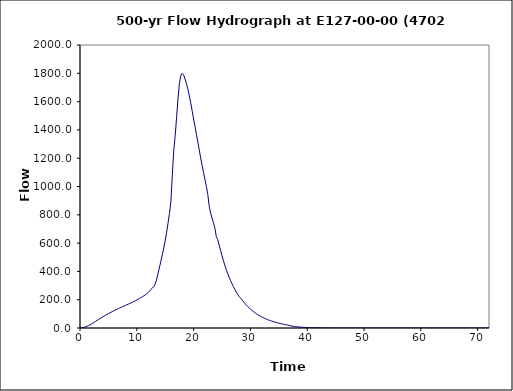
| Category | Series 0 |
|---|---|
| 0.0 | 0 |
| 0.25 | 0.6 |
| 0.5 | 2.4 |
| 0.75 | 5.6 |
| 1.0 | 9.3 |
| 1.25 | 13 |
| 1.5 | 17.1 |
| 1.75 | 22.1 |
| 2.0 | 27.8 |
| 2.25 | 34 |
| 2.5 | 40.4 |
| 2.75 | 46.8 |
| 3.0 | 53.3 |
| 3.25 | 59.8 |
| 3.5 | 66.1 |
| 3.75 | 72.3 |
| 4.0 | 78.4 |
| 4.25 | 84.4 |
| 4.5 | 90.2 |
| 4.75 | 95.9 |
| 5.0 | 101.5 |
| 5.25 | 106.9 |
| 5.5 | 112.2 |
| 5.75 | 117.4 |
| 6.0 | 122.5 |
| 6.25 | 127.5 |
| 6.5 | 132.3 |
| 6.75 | 137.1 |
| 7.0 | 141.8 |
| 7.25 | 146.4 |
| 7.5 | 150.9 |
| 7.75 | 155.4 |
| 8.0 | 159.8 |
| 8.25 | 164.1 |
| 8.5 | 168.5 |
| 8.75 | 172.9 |
| 9.0 | 177.5 |
| 9.25 | 182.3 |
| 9.5 | 187.3 |
| 9.75 | 192.6 |
| 10.0 | 198.1 |
| 10.25 | 203.8 |
| 10.5 | 209.4 |
| 10.75 | 215.2 |
| 11.0 | 221.2 |
| 11.25 | 227.6 |
| 11.5 | 234.6 |
| 11.75 | 242 |
| 12.0 | 250.1 |
| 12.25 | 261 |
| 12.5 | 272.3 |
| 12.75 | 282.1 |
| 13.0 | 293.8 |
| 13.25 | 312.9 |
| 13.5 | 345.9 |
| 13.75 | 387.7 |
| 14.0 | 430.7 |
| 14.25 | 474.2 |
| 14.5 | 519.7 |
| 14.75 | 565.1 |
| 15.0 | 616.7 |
| 15.25 | 675 |
| 15.5 | 742.5 |
| 15.75 | 809.1 |
| 16.0 | 892.6 |
| 16.25 | 1079.1 |
| 16.5 | 1253.3 |
| 16.75 | 1355 |
| 17.0 | 1486.6 |
| 17.25 | 1617.8 |
| 17.5 | 1728.8 |
| 17.75 | 1784.6 |
| 18.0 | 1799.1 |
| 18.25 | 1786.8 |
| 18.5 | 1759.4 |
| 18.75 | 1725.2 |
| 19.0 | 1685.9 |
| 19.25 | 1640.1 |
| 19.5 | 1588.2 |
| 19.75 | 1533.2 |
| 20.0 | 1476.7 |
| 20.25 | 1423.1 |
| 20.5 | 1369.1 |
| 20.75 | 1312.9 |
| 21.0 | 1256.4 |
| 21.25 | 1201.3 |
| 21.5 | 1148.8 |
| 21.75 | 1098 |
| 22.0 | 1048.8 |
| 22.25 | 999.6 |
| 22.5 | 943.3 |
| 22.75 | 859.5 |
| 23.0 | 812.7 |
| 23.25 | 776.2 |
| 23.5 | 742.7 |
| 23.75 | 704.3 |
| 24.0 | 645.8 |
| 24.25 | 622.8 |
| 24.5 | 585.9 |
| 24.75 | 546.6 |
| 25.0 | 510.1 |
| 25.25 | 475.8 |
| 25.5 | 442.5 |
| 25.75 | 412 |
| 26.0 | 385.1 |
| 26.25 | 359.4 |
| 26.5 | 335.7 |
| 26.75 | 313.5 |
| 27.0 | 292.8 |
| 27.25 | 273.5 |
| 27.5 | 255.4 |
| 27.75 | 238.4 |
| 28.0 | 222.7 |
| 28.25 | 212.3 |
| 28.5 | 200.1 |
| 28.75 | 186.9 |
| 29.0 | 174.7 |
| 29.25 | 163.4 |
| 29.5 | 152.7 |
| 29.75 | 142.8 |
| 30.0 | 133.6 |
| 30.25 | 124.9 |
| 30.5 | 116.8 |
| 30.75 | 109.3 |
| 31.0 | 102.2 |
| 31.25 | 95.6 |
| 31.5 | 89.4 |
| 31.75 | 83.7 |
| 32.0 | 78.3 |
| 32.25 | 73.2 |
| 32.5 | 68.4 |
| 32.75 | 64 |
| 33.0 | 59.8 |
| 33.25 | 55.9 |
| 33.5 | 52.3 |
| 33.75 | 48.8 |
| 34.0 | 45.6 |
| 34.25 | 42.5 |
| 34.5 | 39.6 |
| 34.75 | 36.8 |
| 35.0 | 34.2 |
| 35.25 | 31.7 |
| 35.5 | 29.4 |
| 35.75 | 27.2 |
| 36.0 | 25.1 |
| 36.25 | 23.1 |
| 36.5 | 21.2 |
| 36.75 | 19.1 |
| 37.0 | 16.6 |
| 37.25 | 13.8 |
| 37.5 | 11.6 |
| 37.75 | 10.3 |
| 38.0 | 9.2 |
| 38.25 | 8.2 |
| 38.5 | 7.3 |
| 38.75 | 6.5 |
| 39.0 | 5.8 |
| 39.25 | 5.1 |
| 39.5 | 4.5 |
| 39.75 | 4 |
| 40.0 | 3.5 |
| 40.25 | 3.1 |
| 40.5 | 2.8 |
| 40.75 | 2.5 |
| 41.0 | 2.3 |
| 41.25 | 2 |
| 41.5 | 1.8 |
| 41.75 | 1.6 |
| 42.0 | 1.4 |
| 42.25 | 1.2 |
| 42.5 | 1.1 |
| 42.75 | 0.9 |
| 43.0 | 0.8 |
| 43.25 | 0.7 |
| 43.5 | 0.5 |
| 43.75 | 0.4 |
| 44.0 | 0.3 |
| 44.25 | 0.2 |
| 44.5 | 0.2 |
| 44.75 | 0.1 |
| 45.0 | 0 |
| 45.25 | 0 |
| 45.5 | 0 |
| 45.75 | 0 |
| 46.0 | 0 |
| 46.25 | 0 |
| 46.5 | 0 |
| 46.75 | 0 |
| 47.0 | 0 |
| 47.25 | 0 |
| 47.5 | 0 |
| 47.75 | 0 |
| 48.0 | 0 |
| 48.25 | 0 |
| 48.5 | 0 |
| 48.75 | 0 |
| 49.0 | 0 |
| 49.25 | 0 |
| 49.5 | 0 |
| 49.75 | 0 |
| 50.0 | 0 |
| 50.25 | 0 |
| 50.5 | 0 |
| 50.75 | 0 |
| 51.0 | 0 |
| 51.25 | 0 |
| 51.5 | 0 |
| 51.75 | 0 |
| 52.0 | 0 |
| 52.25 | 0 |
| 52.5 | 0 |
| 52.75 | 0 |
| 53.0 | 0 |
| 53.25 | 0 |
| 53.5 | 0 |
| 53.75 | 0 |
| 54.0 | 0 |
| 54.25 | 0 |
| 54.5 | 0 |
| 54.75 | 0 |
| 55.0 | 0 |
| 55.25 | 0 |
| 55.5 | 0 |
| 55.75 | 0 |
| 56.0 | 0 |
| 56.25 | 0 |
| 56.5 | 0 |
| 56.75 | 0 |
| 57.0 | 0 |
| 57.25 | 0 |
| 57.5 | 0 |
| 57.75 | 0 |
| 58.0 | 0 |
| 58.25 | 0 |
| 58.5 | 0 |
| 58.75 | 0 |
| 59.0 | 0 |
| 59.25 | 0 |
| 59.5 | 0 |
| 59.75 | 0 |
| 60.0 | 0 |
| 60.25 | 0 |
| 60.5 | 0 |
| 60.75 | 0 |
| 61.0 | 0 |
| 61.25 | 0 |
| 61.5 | 0 |
| 61.75 | 0 |
| 62.0 | 0 |
| 62.25 | 0 |
| 62.5 | 0 |
| 62.75 | 0 |
| 63.0 | 0 |
| 63.25 | 0 |
| 63.5 | 0 |
| 63.75 | 0 |
| 64.0 | 0 |
| 64.25 | 0 |
| 64.5 | 0 |
| 64.75 | 0 |
| 65.0 | 0 |
| 65.25 | 0 |
| 65.5 | 0 |
| 65.75 | 0 |
| 66.0 | 0 |
| 66.25 | 0 |
| 66.5 | 0 |
| 66.75 | 0 |
| 67.0 | 0 |
| 67.25 | 0 |
| 67.5 | 0 |
| 67.75 | 0 |
| 68.0 | 0 |
| 68.25 | 0 |
| 68.5 | 0 |
| 68.75 | 0 |
| 69.0 | 0 |
| 69.25 | 0 |
| 69.5 | 0 |
| 69.75 | 0 |
| 70.0 | 0 |
| 70.25 | 0 |
| 70.5 | 0 |
| 70.75 | 0 |
| 71.0 | 0 |
| 71.25 | 0 |
| 71.5 | 0 |
| 71.75 | 0 |
| 72.0 | 0 |
| 72.25 | 0 |
| 72.5 | 0 |
| 72.75 | 0 |
| 73.0 | 0 |
| 73.25 | 0 |
| 73.5 | 0 |
| 73.75 | 0 |
| 74.0 | 0 |
| 74.25 | 0 |
| 74.5 | 0 |
| 74.75 | 0 |
| 75.0 | 0 |
| 75.25 | 0 |
| 75.5 | 0 |
| 75.75 | 0 |
| 76.0 | 0 |
| 76.25 | 0 |
| 76.5 | 0 |
| 76.75 | 0 |
| 77.0 | 0 |
| 77.25 | 0 |
| 77.5 | 0 |
| 77.75 | 0 |
| 78.0 | 0 |
| 78.25 | 0 |
| 78.5 | 0 |
| 78.75 | 0 |
| 79.0 | 0 |
| 79.25 | 0 |
| 79.5 | 0 |
| 79.75 | 0 |
| 80.0 | 0 |
| 80.25 | 0 |
| 80.5 | 0 |
| 80.75 | 0 |
| 81.0 | 0 |
| 81.25 | 0 |
| 81.5 | 0 |
| 81.75 | 0 |
| 82.0 | 0 |
| 82.25 | 0 |
| 82.5 | 0 |
| 82.75 | 0 |
| 83.0 | 0 |
| 83.25 | 0 |
| 83.5 | 0 |
| 83.75 | 0 |
| 84.0 | 0 |
| 84.25 | 0 |
| 84.5 | 0 |
| 84.75 | 0 |
| 85.0 | 0 |
| 85.25 | 0 |
| 85.5 | 0 |
| 85.75 | 0 |
| 86.0 | 0 |
| 86.25 | 0 |
| 86.5 | 0 |
| 86.75 | 0 |
| 87.0 | 0 |
| 87.25 | 0 |
| 87.5 | 0 |
| 87.75 | 0 |
| 88.0 | 0 |
| 88.25 | 0 |
| 88.5 | 0 |
| 88.75 | 0 |
| 89.0 | 0 |
| 89.25 | 0 |
| 89.5 | 0 |
| 89.75 | 0 |
| 90.0 | 0 |
| 90.25 | 0 |
| 90.5 | 0 |
| 90.75 | 0 |
| 91.0 | 0 |
| 91.25 | 0 |
| 91.5 | 0 |
| 91.75 | 0 |
| 92.0 | 0 |
| 92.25 | 0 |
| 92.5 | 0 |
| 92.75 | 0 |
| 93.0 | 0 |
| 93.25 | 0 |
| 93.5 | 0 |
| 93.75 | 0 |
| 94.0 | 0 |
| 94.25 | 0 |
| 94.5 | 0 |
| 94.75 | 0 |
| 95.0 | 0 |
| 95.25 | 0 |
| 95.5 | 0 |
| 95.75 | 0 |
| 96.0 | 0 |
| 96.25 | 0 |
| 96.5 | 0 |
| 96.75 | 0 |
| 97.0 | 0 |
| 97.25 | 0 |
| 97.5 | 0 |
| 97.75 | 0 |
| 98.0 | 0 |
| 98.25 | 0 |
| 98.5 | 0 |
| 98.75 | 0 |
| 99.0 | 0 |
| 99.25 | 0 |
| 99.5 | 0 |
| 99.75 | 0 |
| 100.0 | 0 |
| 100.25 | 0 |
| 100.5 | 0 |
| 100.75 | 0 |
| 101.0 | 0 |
| 101.25 | 0 |
| 101.5 | 0 |
| 101.75 | 0 |
| 102.0 | 0 |
| 102.25 | 0 |
| 102.5 | 0 |
| 102.75 | 0 |
| 103.0 | 0 |
| 103.25 | 0 |
| 103.5 | 0 |
| 103.75 | 0 |
| 104.0 | 0 |
| 104.25 | 0 |
| 104.5 | 0 |
| 104.75 | 0 |
| 105.0 | 0 |
| 105.25 | 0 |
| 105.5 | 0 |
| 105.75 | 0 |
| 106.0 | 0 |
| 106.25 | 0 |
| 106.5 | 0 |
| 106.75 | 0 |
| 107.0 | 0 |
| 107.25 | 0 |
| 107.5 | 0 |
| 107.75 | 0 |
| 108.0 | 0 |
| 108.25 | 0 |
| 108.5 | 0 |
| 108.75 | 0 |
| 109.0 | 0 |
| 109.25 | 0 |
| 109.5 | 0 |
| 109.75 | 0 |
| 110.0 | 0 |
| 110.25 | 0 |
| 110.5 | 0 |
| 110.75 | 0 |
| 111.0 | 0 |
| 111.25 | 0 |
| 111.5 | 0 |
| 111.75 | 0 |
| 112.0 | 0 |
| 112.25 | 0 |
| 112.5 | 0 |
| 112.75 | 0 |
| 113.0 | 0 |
| 113.25 | 0 |
| 113.5 | 0 |
| 113.75 | 0 |
| 114.0 | 0 |
| 114.25 | 0 |
| 114.5 | 0 |
| 114.75 | 0 |
| 115.0 | 0 |
| 115.25 | 0 |
| 115.5 | 0 |
| 115.75 | 0 |
| 116.0 | 0 |
| 116.25 | 0 |
| 116.5 | 0 |
| 116.75 | 0 |
| 117.0 | 0 |
| 117.25 | 0 |
| 117.5 | 0 |
| 117.75 | 0 |
| 118.0 | 0 |
| 118.25 | 0 |
| 118.5 | 0 |
| 118.75 | 0 |
| 119.0 | 0 |
| 119.25 | 0 |
| 119.5 | 0 |
| 119.75 | 0 |
| 120.0 | 0 |
| 120.25 | 0 |
| 120.5 | 0 |
| 120.75 | 0 |
| 121.0 | 0 |
| 121.25 | 0 |
| 121.5 | 0 |
| 121.75 | 0 |
| 122.0 | 0 |
| 122.25 | 0 |
| 122.5 | 0 |
| 122.75 | 0 |
| 123.0 | 0 |
| 123.25 | 0 |
| 123.5 | 0 |
| 123.75 | 0 |
| 124.0 | 0 |
| 124.25 | 0 |
| 124.5 | 0 |
| 124.75 | 0 |
| 125.0 | 0 |
| 125.25 | 0 |
| 125.5 | 0 |
| 125.75 | 0 |
| 126.0 | 0 |
| 126.25 | 0 |
| 126.5 | 0 |
| 126.75 | 0 |
| 127.0 | 0 |
| 127.25 | 0 |
| 127.5 | 0 |
| 127.75 | 0 |
| 128.0 | 0 |
| 128.25 | 0 |
| 128.5 | 0 |
| 128.75 | 0 |
| 129.0 | 0 |
| 129.25 | 0 |
| 129.5 | 0 |
| 129.75 | 0 |
| 130.0 | 0 |
| 130.25 | 0 |
| 130.5 | 0 |
| 130.75 | 0 |
| 131.0 | 0 |
| 131.25 | 0 |
| 131.5 | 0 |
| 131.75 | 0 |
| 132.0 | 0 |
| 132.25 | 0 |
| 132.5 | 0 |
| 132.75 | 0 |
| 133.0 | 0 |
| 133.25 | 0 |
| 133.5 | 0 |
| 133.75 | 0 |
| 134.0 | 0 |
| 134.25 | 0 |
| 134.5 | 0 |
| 134.75 | 0 |
| 135.0 | 0 |
| 135.25 | 0 |
| 135.5 | 0 |
| 135.75 | 0 |
| 136.0 | 0 |
| 136.25 | 0 |
| 136.5 | 0 |
| 136.75 | 0 |
| 137.0 | 0 |
| 137.25 | 0 |
| 137.5 | 0 |
| 137.75 | 0 |
| 138.0 | 0 |
| 138.25 | 0 |
| 138.5 | 0 |
| 138.75 | 0 |
| 139.0 | 0 |
| 139.25 | 0 |
| 139.5 | 0 |
| 139.75 | 0 |
| 140.0 | 0 |
| 140.25 | 0 |
| 140.5 | 0 |
| 140.75 | 0 |
| 141.0 | 0 |
| 141.25 | 0 |
| 141.5 | 0 |
| 141.75 | 0 |
| 142.0 | 0 |
| 142.25 | 0 |
| 142.5 | 0 |
| 142.75 | 0 |
| 143.0 | 0 |
| 143.25 | 0 |
| 143.5 | 0 |
| 143.75 | 0 |
| 144.0 | 0 |
| 144.25 | 0 |
| 144.5 | 0 |
| 144.75 | 0 |
| 145.0 | 0 |
| 145.25 | 0 |
| 145.5 | 0 |
| 145.75 | 0 |
| 146.0 | 0 |
| 146.25 | 0 |
| 146.5 | 0 |
| 146.75 | 0 |
| 147.0 | 0 |
| 147.25 | 0 |
| 147.5 | 0 |
| 147.75 | 0 |
| 148.0 | 0 |
| 148.25 | 0 |
| 148.5 | 0 |
| 148.75 | 0 |
| 149.0 | 0 |
| 149.25 | 0 |
| 149.5 | 0 |
| 149.75 | 0 |
| 150.0 | 0 |
| 150.25 | 0 |
| 150.5 | 0 |
| 150.75 | 0 |
| 151.0 | 0 |
| 151.25 | 0 |
| 151.5 | 0 |
| 151.75 | 0 |
| 152.0 | 0 |
| 152.25 | 0 |
| 152.5 | 0 |
| 152.75 | 0 |
| 153.0 | 0 |
| 153.25 | 0 |
| 153.5 | 0 |
| 153.75 | 0 |
| 154.0 | 0 |
| 154.25 | 0 |
| 154.5 | 0 |
| 154.75 | 0 |
| 155.0 | 0 |
| 155.25 | 0 |
| 155.5 | 0 |
| 155.75 | 0 |
| 156.0 | 0 |
| 156.25 | 0 |
| 156.5 | 0 |
| 156.75 | 0 |
| 157.0 | 0 |
| 157.25 | 0 |
| 157.5 | 0 |
| 157.75 | 0 |
| 158.0 | 0 |
| 158.25 | 0 |
| 158.5 | 0 |
| 158.75 | 0 |
| 159.0 | 0 |
| 159.25 | 0 |
| 159.5 | 0 |
| 159.75 | 0 |
| 160.0 | 0 |
| 160.25 | 0 |
| 160.5 | 0 |
| 160.75 | 0 |
| 161.0 | 0 |
| 161.25 | 0 |
| 161.5 | 0 |
| 161.75 | 0 |
| 162.0 | 0 |
| 162.25 | 0 |
| 162.5 | 0 |
| 162.75 | 0 |
| 163.0 | 0 |
| 163.25 | 0 |
| 163.5 | 0 |
| 163.75 | 0 |
| 164.0 | 0 |
| 164.25 | 0 |
| 164.5 | 0 |
| 164.75 | 0 |
| 165.0 | 0 |
| 165.25 | 0 |
| 165.5 | 0 |
| 165.75 | 0 |
| 166.0 | 0 |
| 166.25 | 0 |
| 166.5 | 0 |
| 166.75 | 0 |
| 167.0 | 0 |
| 167.25 | 0 |
| 167.5 | 0 |
| 167.75 | 0 |
| 168.0 | 0 |
| 168.25 | 0 |
| 168.5 | 0 |
| 168.75 | 0 |
| 169.0 | 0 |
| 169.25 | 0 |
| 169.5 | 0 |
| 169.75 | 0 |
| 170.0 | 0 |
| 170.25 | 0 |
| 170.5 | 0 |
| 170.75 | 0 |
| 171.0 | 0 |
| 171.25 | 0 |
| 171.5 | 0 |
| 171.75 | 0 |
| 172.0 | 0 |
| 172.25 | 0 |
| 172.5 | 0 |
| 172.75 | 0 |
| 173.0 | 0 |
| 173.25 | 0 |
| 173.5 | 0 |
| 173.75 | 0 |
| 174.0 | 0 |
| 174.25 | 0 |
| 174.5 | 0 |
| 174.75 | 0 |
| 175.0 | 0 |
| 175.25 | 0 |
| 175.5 | 0 |
| 175.75 | 0 |
| 176.0 | 0 |
| 176.25 | 0 |
| 176.5 | 0 |
| 176.75 | 0 |
| 177.0 | 0 |
| 177.25 | 0 |
| 177.5 | 0 |
| 177.75 | 0 |
| 178.0 | 0 |
| 178.25 | 0 |
| 178.5 | 0 |
| 178.75 | 0 |
| 179.0 | 0 |
| 179.25 | 0 |
| 179.5 | 0 |
| 179.75 | 0 |
| 180.0 | 0 |
| 180.25 | 0 |
| 180.5 | 0 |
| 180.75 | 0 |
| 181.0 | 0 |
| 181.25 | 0 |
| 181.5 | 0 |
| 181.75 | 0 |
| 182.0 | 0 |
| 182.25 | 0 |
| 182.5 | 0 |
| 182.75 | 0 |
| 183.0 | 0 |
| 183.25 | 0 |
| 183.5 | 0 |
| 183.75 | 0 |
| 184.0 | 0 |
| 184.25 | 0 |
| 184.5 | 0 |
| 184.75 | 0 |
| 185.0 | 0 |
| 185.25 | 0 |
| 185.5 | 0 |
| 185.75 | 0 |
| 186.0 | 0 |
| 186.25 | 0 |
| 186.5 | 0 |
| 186.75 | 0 |
| 187.0 | 0 |
| 187.25 | 0 |
| 187.5 | 0 |
| 187.75 | 0 |
| 188.0 | 0 |
| 188.25 | 0 |
| 188.5 | 0 |
| 188.75 | 0 |
| 189.0 | 0 |
| 189.25 | 0 |
| 189.5 | 0 |
| 189.75 | 0 |
| 190.0 | 0 |
| 190.25 | 0 |
| 190.5 | 0 |
| 190.75 | 0 |
| 191.0 | 0 |
| 191.25 | 0 |
| 191.5 | 0 |
| 191.75 | 0 |